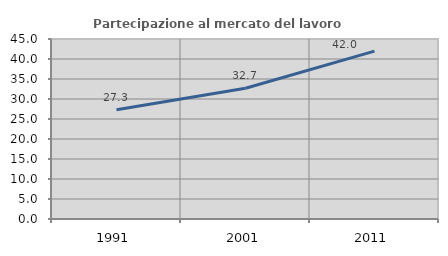
| Category | Partecipazione al mercato del lavoro  femminile |
|---|---|
| 1991.0 | 27.333 |
| 2001.0 | 32.692 |
| 2011.0 | 41.958 |